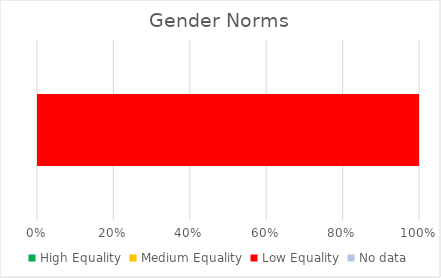
| Category | High Equality | Medium Equality | Low Equality | No data |
|---|---|---|---|---|
| 0 | 0 | 0 | 4 | 0 |